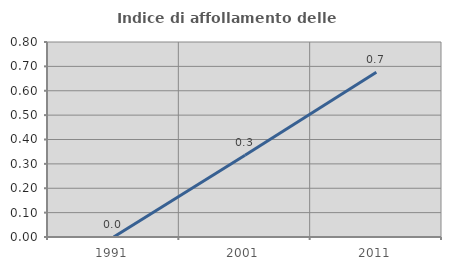
| Category | Indice di affollamento delle abitazioni  |
|---|---|
| 1991.0 | 0 |
| 2001.0 | 0.336 |
| 2011.0 | 0.676 |